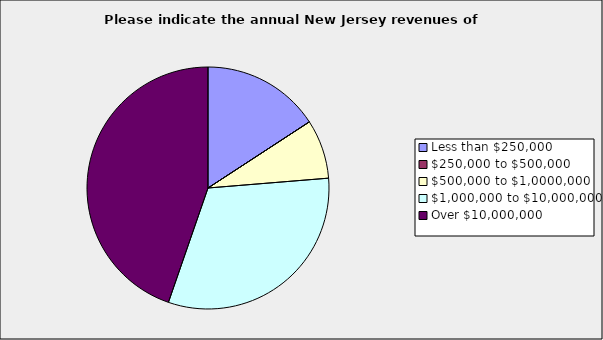
| Category | Series 0 |
|---|---|
| Less than $250,000 | 0.158 |
| $250,000 to $500,000 | 0 |
| $500,000 to $1,0000,000 | 0.079 |
| $1,000,000 to $10,000,000 | 0.316 |
| Over $10,000,000 | 0.447 |